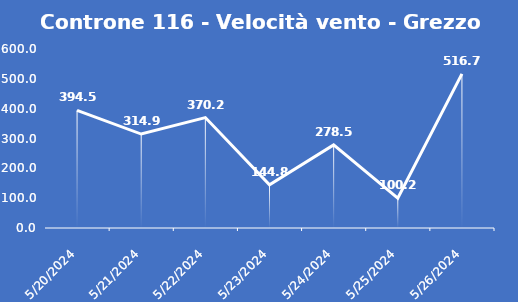
| Category | Controne 116 - Velocità vento - Grezzo (min) |
|---|---|
| 5/20/24 | 394.5 |
| 5/21/24 | 314.9 |
| 5/22/24 | 370.2 |
| 5/23/24 | 144.8 |
| 5/24/24 | 278.5 |
| 5/25/24 | 100.2 |
| 5/26/24 | 516.7 |